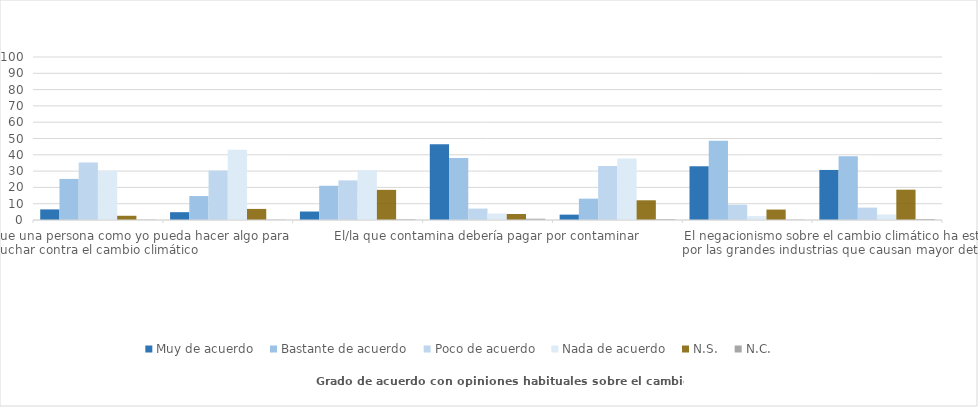
| Category | Muy de acuerdo | Bastante de acuerdo | Poco de acuerdo | Nada de acuerdo | N.S. | N.C. |
|---|---|---|---|---|---|---|
| Es muy difícil que una persona como yo pueda hacer algo para luchar contra el cambio climático | 6.5 | 25.2 | 35.3 | 30.2 | 2.6 | 0.2 |
| Se exagera mucho al hablar del peligro que supone el cambio climático | 4.8 | 14.7 | 30.3 | 43.1 | 6.8 | 0.2 |
| Los/as que nos asustan sobre el cambio climático están al servicio de las compañías ecologistas | 5.2 | 21 | 24.3 | 30.6 | 18.5 | 0.4 |
| El/la que contamina debería pagar por contaminar | 46.5 | 38 | 7 | 4 | 3.7 | 0.8 |
| La ciencia y la tecnología por sí solas resolverán el problema del cambio climático | 3.3 | 13.1 | 33.2 | 37.8 | 12.1 | 0.5 |
| Cambiar nuestras formas de vida, ayudaría a resolver el problema del cambio climático | 33 | 48.6 | 9.4 | 2.4 | 6.4 | 0.2 |
| El negacionismo sobre el cambio climático ha estado promovido por las grandes industrias que causan mayor deterioro ecológico | 30.7 | 39.1 | 7.6 | 3.4 | 18.6 | 0.6 |